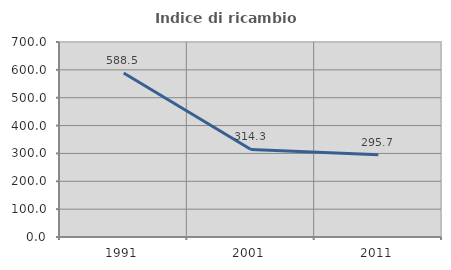
| Category | Indice di ricambio occupazionale  |
|---|---|
| 1991.0 | 588.462 |
| 2001.0 | 314.286 |
| 2011.0 | 295.652 |